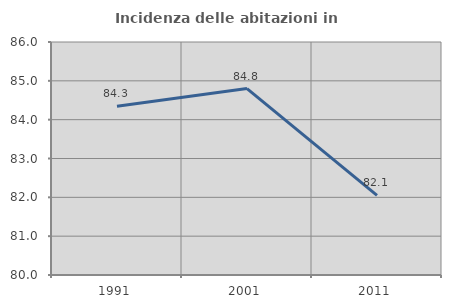
| Category | Incidenza delle abitazioni in proprietà  |
|---|---|
| 1991.0 | 84.348 |
| 2001.0 | 84.8 |
| 2011.0 | 82.051 |